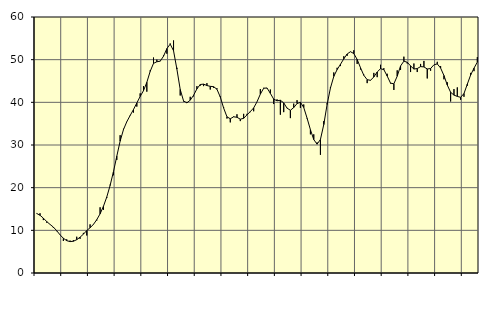
| Category | Piggar | Series 1 |
|---|---|---|
| nan | 13.9 | 13.96 |
| 87.0 | 14 | 13.53 |
| 87.0 | 12.4 | 12.86 |
| 87.0 | 11.8 | 12.06 |
| nan | 11.4 | 11.39 |
| 88.0 | 10.6 | 10.76 |
| 88.0 | 9.8 | 9.91 |
| 88.0 | 9 | 8.95 |
| nan | 7.5 | 8.14 |
| 89.0 | 7.9 | 7.58 |
| 89.0 | 7.6 | 7.36 |
| 89.0 | 7.7 | 7.44 |
| nan | 8.5 | 7.81 |
| 90.0 | 8 | 8.39 |
| 90.0 | 9.4 | 9.1 |
| 90.0 | 8.8 | 9.94 |
| nan | 11.4 | 10.61 |
| 91.0 | 11.3 | 11.38 |
| 91.0 | 12.3 | 12.5 |
| 91.0 | 15.4 | 13.87 |
| nan | 14.8 | 15.62 |
| 92.0 | 17.6 | 17.81 |
| 92.0 | 20.7 | 20.52 |
| 92.0 | 22.9 | 23.73 |
| nan | 26.5 | 27.37 |
| 93.0 | 32.3 | 30.9 |
| 93.0 | 33.8 | 33.6 |
| 93.0 | 35.5 | 35.46 |
| nan | 37 | 36.92 |
| 94.0 | 37.6 | 38.31 |
| 94.0 | 39 | 39.85 |
| 94.0 | 42.1 | 41.38 |
| nan | 43.8 | 42.73 |
| 95.0 | 42.5 | 44.69 |
| 95.0 | 47.5 | 47.26 |
| 95.0 | 50.5 | 49.13 |
| nan | 50 | 49.51 |
| 96.0 | 49.7 | 49.65 |
| 96.0 | 51 | 50.81 |
| 96.0 | 51.4 | 52.59 |
| nan | 53.8 | 53.65 |
| 97.0 | 54.5 | 52.09 |
| 97.0 | 48.1 | 47.79 |
| 97.0 | 41.6 | 43.02 |
| nan | 40.2 | 40.33 |
| 98.0 | 40.1 | 39.88 |
| 98.0 | 41.3 | 40.5 |
| 98.0 | 41.4 | 41.65 |
| nan | 43.8 | 43.15 |
| 99.0 | 43.9 | 44.18 |
| 99.0 | 43.8 | 44.27 |
| 99.0 | 44.5 | 43.94 |
| nan | 43 | 43.75 |
| 0.0 | 43.4 | 43.67 |
| 0.0 | 43.3 | 43.07 |
| 0.0 | 41.4 | 41.26 |
| nan | 38.9 | 38.68 |
| 1.0 | 36.2 | 36.61 |
| 1.0 | 35.3 | 36.15 |
| 1.0 | 36.7 | 36.61 |
| nan | 37.2 | 36.5 |
| 2.0 | 35.6 | 36.05 |
| 2.0 | 37.3 | 36.25 |
| 2.0 | 37.3 | 37.06 |
| nan | 37.7 | 37.83 |
| 3.0 | 37.9 | 38.69 |
| 3.0 | 40.1 | 40.12 |
| 3.0 | 43.1 | 41.92 |
| nan | 43.4 | 43.3 |
| 4.0 | 43.3 | 43.37 |
| 4.0 | 43 | 42.1 |
| 4.0 | 39.6 | 40.75 |
| nan | 40.7 | 40.36 |
| 5.0 | 37.1 | 40.49 |
| 5.0 | 37.7 | 39.87 |
| 5.0 | 38.7 | 38.64 |
| nan | 36.3 | 38.14 |
| 6.0 | 39.7 | 38.77 |
| 6.0 | 40.5 | 39.71 |
| 6.0 | 38.7 | 40.02 |
| nan | 39.5 | 38.79 |
| 7.0 | 36.2 | 36.3 |
| 7.0 | 32.5 | 33.59 |
| 7.0 | 32.5 | 31.27 |
| nan | 30.6 | 30.2 |
| 8.0 | 27.7 | 31.29 |
| 8.0 | 35.6 | 34.79 |
| 8.0 | 39.8 | 39.49 |
| nan | 43.6 | 43.36 |
| 9.0 | 47 | 46.08 |
| 9.0 | 48.1 | 47.67 |
| 9.0 | 48.5 | 48.91 |
| nan | 50.8 | 50.2 |
| 10.0 | 50.9 | 51.33 |
| 10.0 | 51.9 | 51.87 |
| 10.0 | 52.2 | 51.43 |
| nan | 49 | 50.06 |
| 11.0 | 47.7 | 48.12 |
| 11.0 | 46.5 | 46.33 |
| 11.0 | 44.5 | 45.31 |
| nan | 45.1 | 45.16 |
| 12.0 | 46.9 | 45.95 |
| 12.0 | 45.9 | 47.11 |
| 12.0 | 48.8 | 47.88 |
| nan | 48 | 47.66 |
| 13.0 | 46.7 | 46.16 |
| 13.0 | 44.4 | 44.5 |
| 13.0 | 42.9 | 44.34 |
| nan | 47.5 | 46.13 |
| 14.0 | 47.6 | 48.52 |
| 14.0 | 50.7 | 49.65 |
| 14.0 | 49.1 | 49.39 |
| nan | 47.1 | 48.54 |
| 15.0 | 49.1 | 47.8 |
| 15.0 | 47.1 | 47.92 |
| 15.0 | 49 | 48.37 |
| nan | 49.7 | 48.3 |
| 16.0 | 45.6 | 47.82 |
| 16.0 | 47.4 | 47.92 |
| 16.0 | 48.8 | 48.8 |
| nan | 49.5 | 49 |
| 17.0 | 48.5 | 48.04 |
| 17.0 | 45.4 | 46.28 |
| 17.0 | 44.7 | 44.05 |
| nan | 40.2 | 42.36 |
| 18.0 | 43.1 | 41.69 |
| 18.0 | 43.5 | 41.39 |
| 18.0 | 40.6 | 41.17 |
| nan | 41.3 | 42.06 |
| 19.0 | 43.9 | 44.26 |
| 19.0 | 46.9 | 46.41 |
| 19.0 | 47.3 | 48.01 |
| nan | 50.6 | 49.43 |